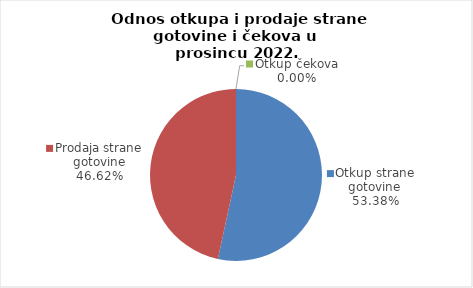
| Category | Series 0 |
|---|---|
| Otkup strane gotovine | 53.383 |
| Prodaja strane gotovine | 46.617 |
| Otkup čekova | 0 |